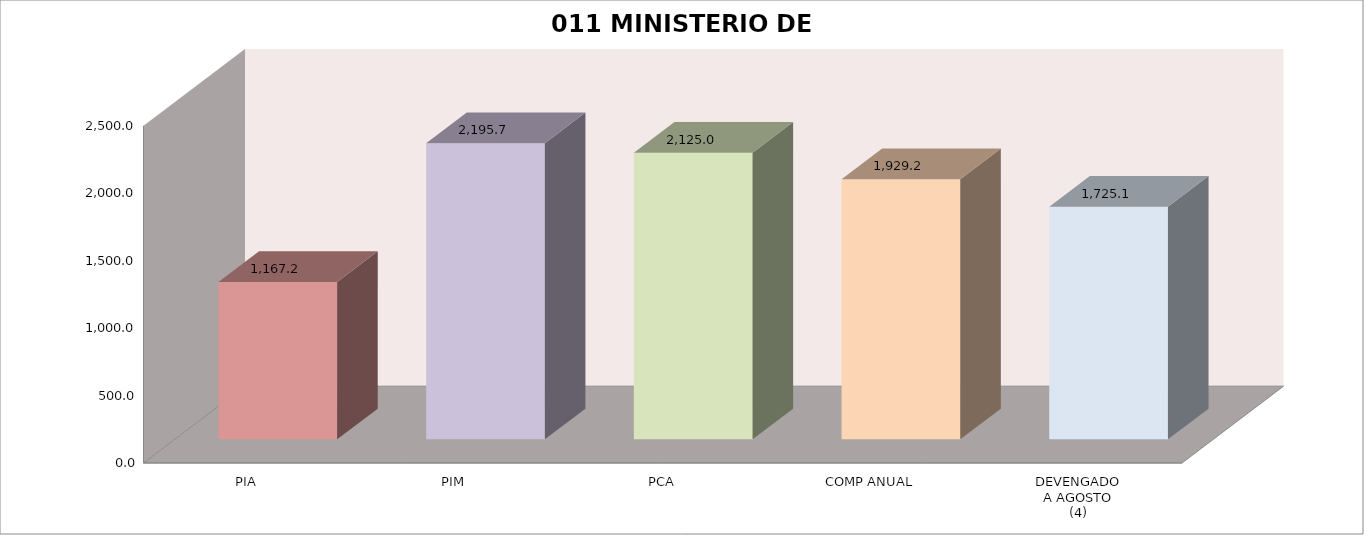
| Category | 011 MINISTERIO DE SALUD |
|---|---|
| PIA | 1167.209 |
| PIM | 2195.653 |
| PCA | 2125.011 |
| COMP ANUAL | 1929.217 |
| DEVENGADO
A AGOSTO
(4) | 1725.065 |